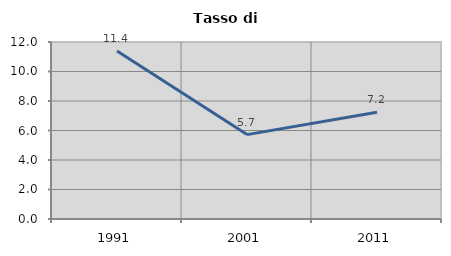
| Category | Tasso di disoccupazione   |
|---|---|
| 1991.0 | 11.395 |
| 2001.0 | 5.721 |
| 2011.0 | 7.24 |